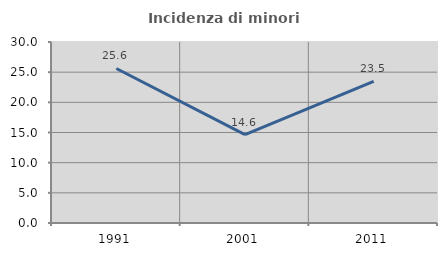
| Category | Incidenza di minori stranieri |
|---|---|
| 1991.0 | 25.61 |
| 2001.0 | 14.634 |
| 2011.0 | 23.481 |